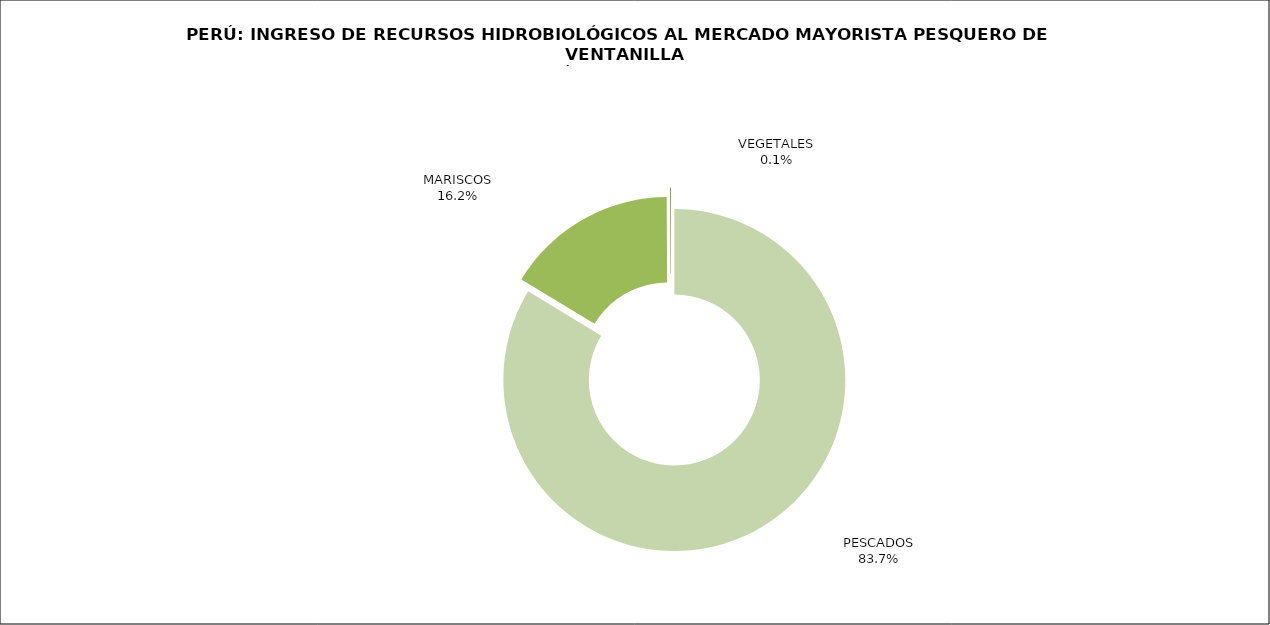
| Category | Series 0 |
|---|---|
| PESCADOS | 47074.479 |
| MARISCOS | 9135.483 |
| VEGETALES | 49.735 |